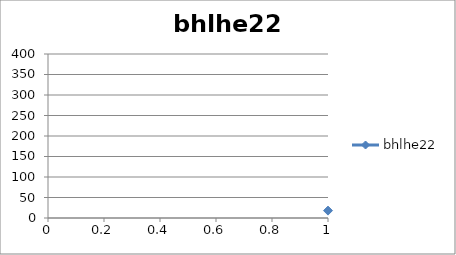
| Category | bhlhe22 |
|---|---|
| 0 | 18 |
| 1 | 18 |
| 2 | 14 |
| 3 | 6 |
| 4 | 13 |
| 5 | 4 |
| 6 | 353 |
| 7 | 0 |
| 8 | 0 |
| 9 | 5 |
| 10 | 0 |